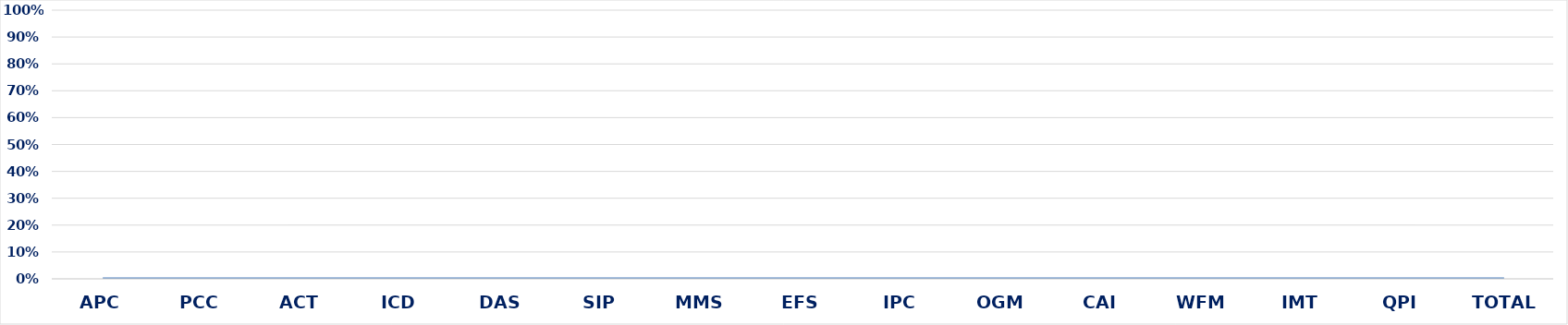
| Category | Series 0 |
|---|---|
| APC | 0 |
| PCC | 0 |
| ACT | 0 |
| ICD | 0 |
| DAS | 0 |
| SIP | 0 |
| MMS | 0 |
| EFS | 0 |
| IPC | 0 |
| OGM | 0 |
| CAI | 0 |
| WFM | 0 |
| IMT | 0 |
| QPI | 0 |
| TOTAL | 0 |